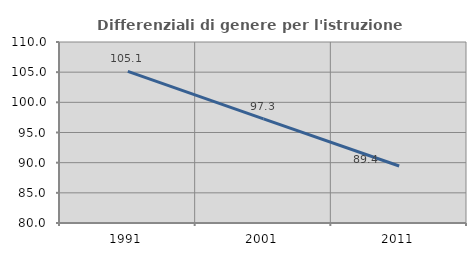
| Category | Differenziali di genere per l'istruzione superiore |
|---|---|
| 1991.0 | 105.125 |
| 2001.0 | 97.258 |
| 2011.0 | 89.443 |